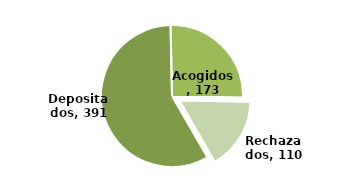
| Category | Series 0 |
|---|---|
| Depositados | 391 |
| Acogidos | 173 |
| Rechazados | 110 |